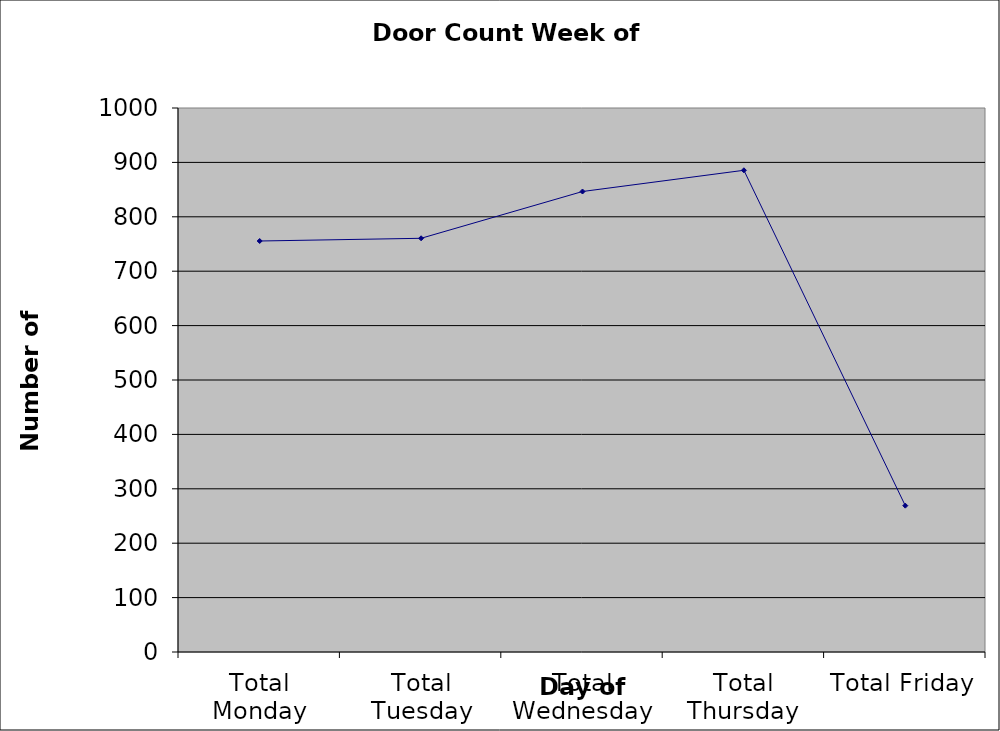
| Category | Series 0 |
|---|---|
| Total Monday | 755.5 |
| Total Tuesday | 760.5 |
| Total Wednesday | 846.5 |
| Total Thursday | 885.5 |
| Total Friday | 269 |